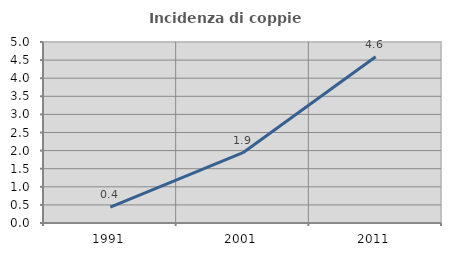
| Category | Incidenza di coppie miste |
|---|---|
| 1991.0 | 0.439 |
| 2001.0 | 1.942 |
| 2011.0 | 4.592 |